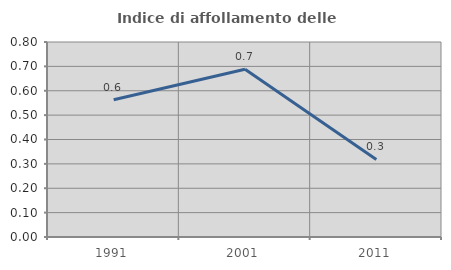
| Category | Indice di affollamento delle abitazioni  |
|---|---|
| 1991.0 | 0.563 |
| 2001.0 | 0.688 |
| 2011.0 | 0.318 |